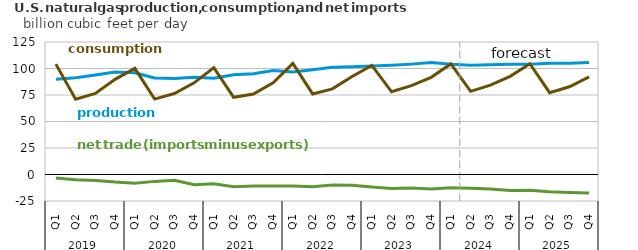
| Category | World production | World consumption | net imports |
|---|---|---|---|
| 2019-Q1 | 89.794 | 104.125 | -3.234 |
| 2019-Q2 | 91.257 | 71.052 | -4.963 |
| 2019-Q3 | 93.764 | 76.457 | -5.588 |
| 2019-Q4 | 96.596 | 89.794 | -7.164 |
| 2020-Q1 | 96.052 | 100.165 | -8.225 |
| 2020-Q2 | 91.062 | 71.148 | -6.491 |
| 2020-Q3 | 90.67 | 76.408 | -5.531 |
| 2020-Q4 | 91.763 | 86.47 | -9.625 |
| 2021-Q1 | 90.822 | 100.789 | -8.758 |
| 2021-Q2 | 94.124 | 72.858 | -11.653 |
| 2021-Q3 | 95.157 | 76.001 | -10.829 |
| 2021-Q4 | 98.212 | 86.44 | -10.866 |
| 2022-Q1 | 96.628 | 104.811 | -10.918 |
| 2022-Q2 | 98.924 | 76.028 | -11.572 |
| 2022-Q3 | 101.198 | 80.762 | -9.971 |
| 2022-Q4 | 101.567 | 92.462 | -10.074 |
| 2023-Q1 | 102.264 | 102.976 | -11.839 |
| 2023-Q2 | 103.158 | 78.017 | -13.168 |
| 2023-Q3 | 104.125 | 83.868 | -12.631 |
| 2023-Q4 | 105.613 | 91.678 | -13.652 |
| 2024-Q1 | 103.9 | 104.318 | -12.53 |
| 2024-Q2 | 102.965 | 78.475 | -12.977 |
| 2024-Q3 | 103.423 | 84.375 | -13.751 |
| 2024-Q4 | 104.026 | 92.564 | -15.156 |
| 2025-Q1 | 103.896 | 104.548 | -14.849 |
| 2025-Q2 | 104.951 | 77.194 | -16.329 |
| 2025-Q3 | 104.986 | 82.775 | -16.968 |
| 2025-Q4 | 105.662 | 92.154 | -17.362 |